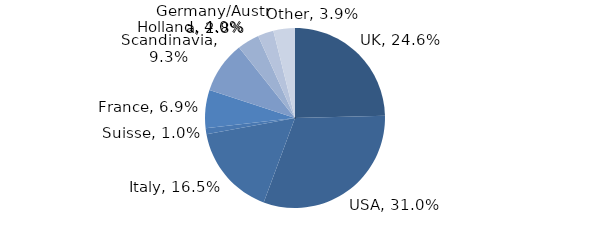
| Category | Investment Style |
|---|---|
| UK | 0.246 |
| USA | 0.31 |
| Italy | 0.165 |
| Suisse | 0.01 |
| France | 0.069 |
| Scandinavia | 0.093 |
| Holland | 0.04 |
| Germany/Austria | 0.028 |
| Other | 0.039 |